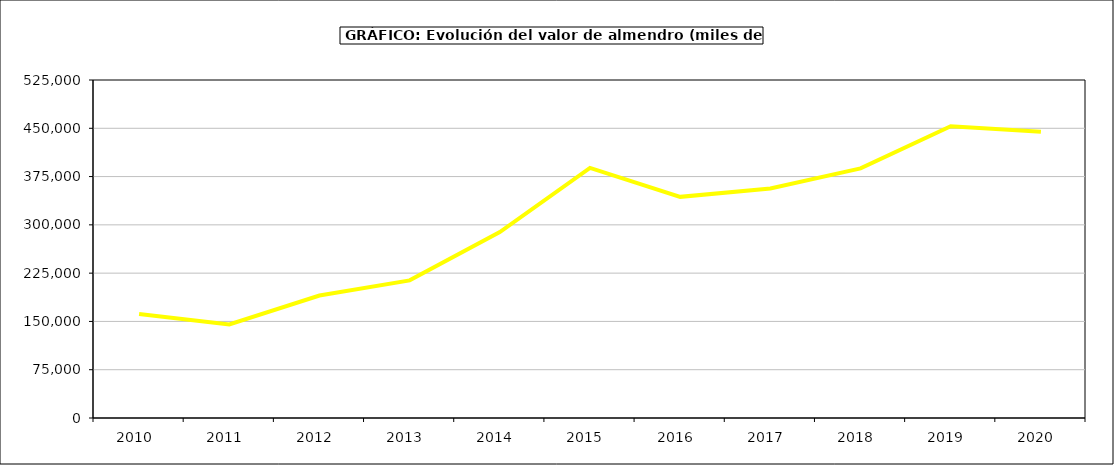
| Category | valor almendro |
|---|---|
| 2010.0 | 161485.094 |
| 2011.0 | 145270.034 |
| 2012.0 | 190305.336 |
| 2013.0 | 213791.63 |
| 2014.0 | 288832.154 |
| 2015.0 | 388475 |
| 2016.0 | 343509 |
| 2017.0 | 356619.875 |
| 2018.0 | 387785.945 |
| 2019.0 | 453304.604 |
| 2020.0 | 444587.745 |